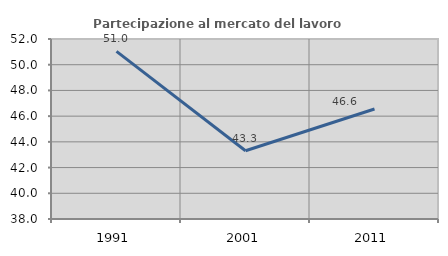
| Category | Partecipazione al mercato del lavoro  femminile |
|---|---|
| 1991.0 | 51.039 |
| 2001.0 | 43.305 |
| 2011.0 | 46.556 |